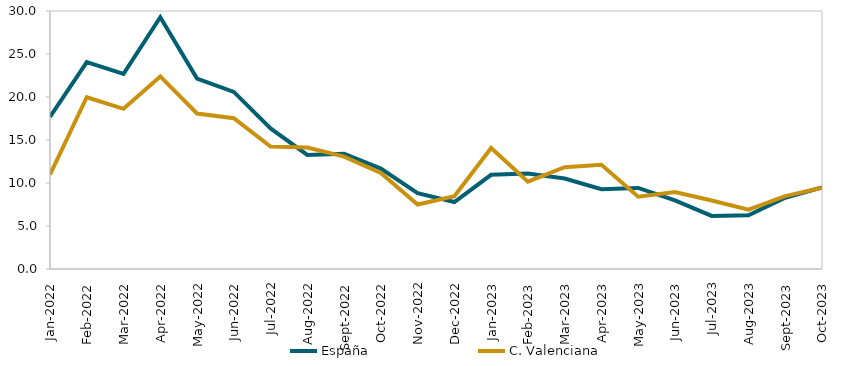
| Category | España | C. Valenciana |
|---|---|---|
| 2022-01-01 | 17.69 | 10.98 |
| 2022-02-01 | 24.06 | 19.97 |
| 2022-03-01 | 22.69 | 18.62 |
| 2022-04-01 | 29.27 | 22.39 |
| 2022-05-01 | 22.15 | 18.08 |
| 2022-06-01 | 20.59 | 17.53 |
| 2022-07-01 | 16.35 | 14.24 |
| 2022-08-01 | 13.26 | 14.13 |
| 2022-09-01 | 13.41 | 13.06 |
| 2022-10-01 | 11.67 | 11.16 |
| 2022-11-01 | 8.82 | 7.5 |
| 2022-12-01 | 7.79 | 8.46 |
| 2023-01-01 | 10.95 | 14.07 |
| 2023-02-01 | 11.11 | 10.16 |
| 2023-03-01 | 10.52 | 11.84 |
| 2023-04-01 | 9.28 | 12.12 |
| 2023-05-01 | 9.43 | 8.41 |
| 2023-06-01 | 7.99 | 8.96 |
| 2023-07-01 | 6.17 | 7.96 |
| 2023-08-01 | 6.25 | 6.9 |
| 2023-09-01 | 8.29 | 8.47 |
| 2023-10-01 | 9.49 | 9.44 |